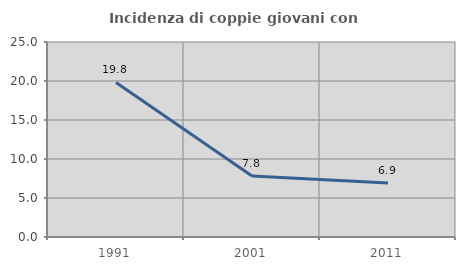
| Category | Incidenza di coppie giovani con figli |
|---|---|
| 1991.0 | 19.82 |
| 2001.0 | 7.812 |
| 2011.0 | 6.923 |